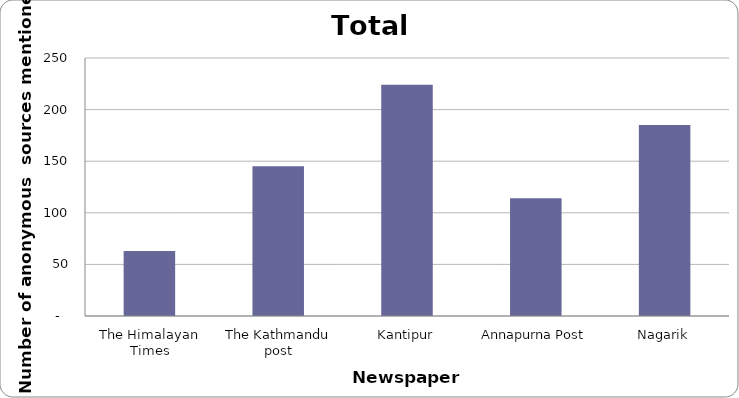
| Category | Series 0 |
|---|---|
| The Himalayan Times | 63 |
| The Kathmandu post | 145 |
| Kantipur | 224 |
| Annapurna Post | 114 |
| Nagarik | 185 |